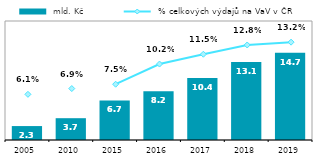
| Category |  mld. Kč |
|---|---|
| 2005.0 | 2.342 |
| 2010.0 | 3.664 |
| 2015.0 | 6.651 |
| 2016.0 | 8.182 |
| 2017.0 | 10.424 |
| 2018.0 | 13.125 |
| 2019.0 | 14.683 |